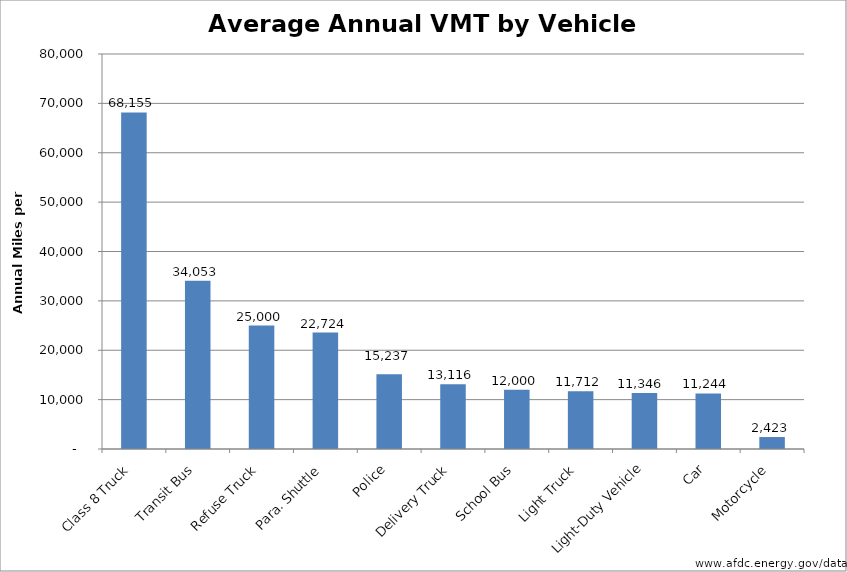
| Category | Series 0 |
|---|---|
| Class 8 Truck | 68155.446 |
| Transit Bus | 34052.953 |
| Refuse Truck | 25000 |
| Para. Shuttle | 23576.466 |
| Police | 15160 |
| Delivery Truck | 13116.173 |
| School Bus | 12000 |
| Light Truck | 11711.927 |
| Light-Duty Vehicle | 11345.997 |
| Car | 11243.827 |
| Motorcycle | 2423.211 |